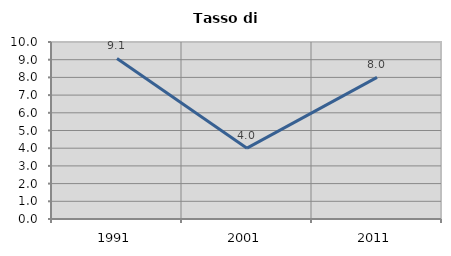
| Category | Tasso di disoccupazione   |
|---|---|
| 1991.0 | 9.069 |
| 2001.0 | 4.003 |
| 2011.0 | 8.003 |